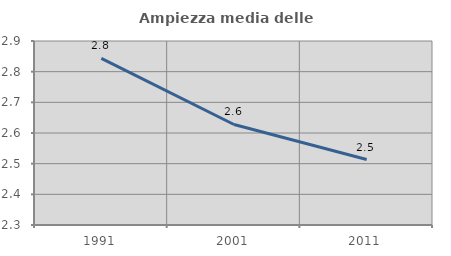
| Category | Ampiezza media delle famiglie |
|---|---|
| 1991.0 | 2.843 |
| 2001.0 | 2.628 |
| 2011.0 | 2.513 |